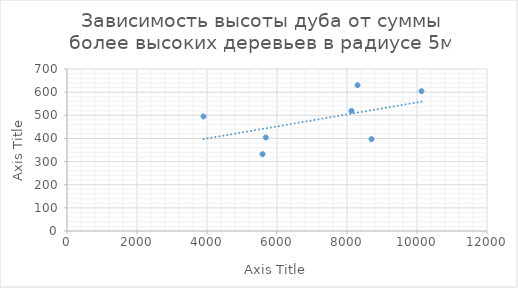
| Category | Series 0 |
|---|---|
| 5680.0 | 404 |
| 8300.0 | 630 |
| 5587.0 | 332 |
| 8126.0 | 519 |
| 3900.0 | 495 |
| 8700.0 | 397 |
| 10128.0 | 604 |